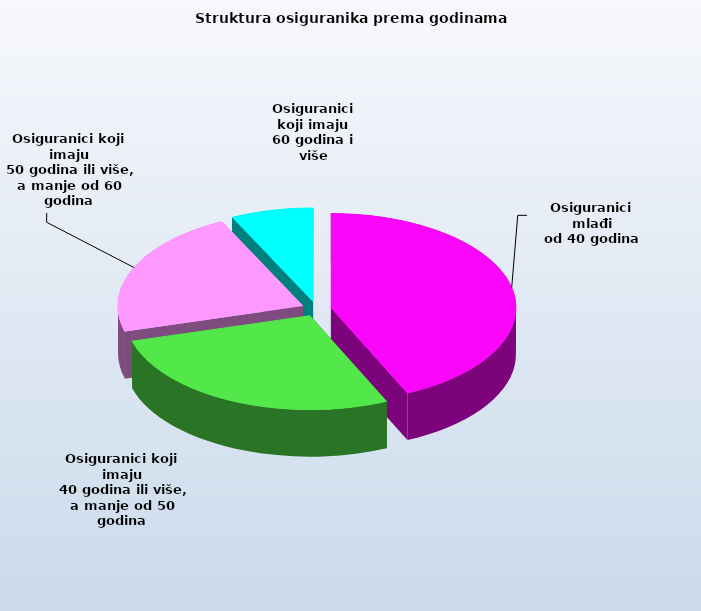
| Category | Series 0 |
|---|---|
| Osiguranici mlađi
od 40 godina | 679615 |
| Osiguranici koji imaju
 40 godina ili više, a manje od 50 godina | 431250 |
| Osiguranici koji imaju
 50 godina ili više, a manje od 60 godina | 348508 |
| Osiguranici koji imaju
60 godina i više | 113503 |